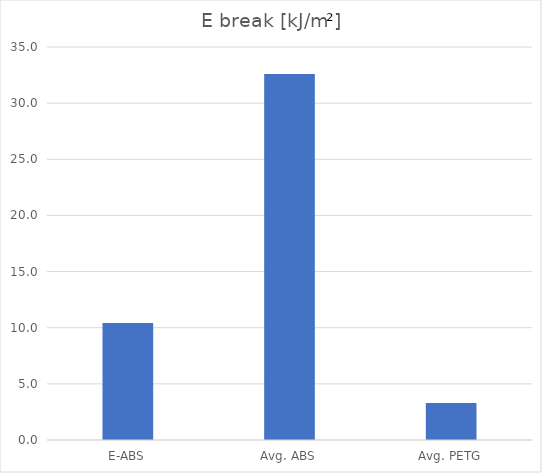
| Category | kJ/m² |
|---|---|
| E-ABS | 10.423 |
| Avg. ABS | 32.6 |
| Avg. PETG | 3.3 |